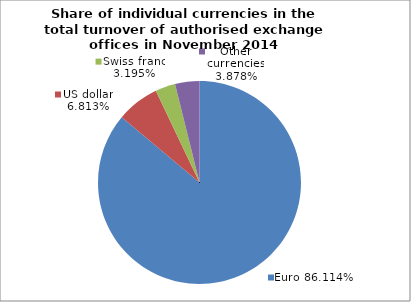
| Category | EUR |
|---|---|
| 0 | 0.861 |
| 1 | 0.068 |
| 2 | 0.032 |
| 3 | 0.039 |